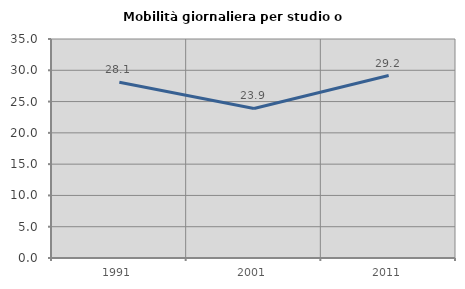
| Category | Mobilità giornaliera per studio o lavoro |
|---|---|
| 1991.0 | 28.09 |
| 2001.0 | 23.894 |
| 2011.0 | 29.167 |